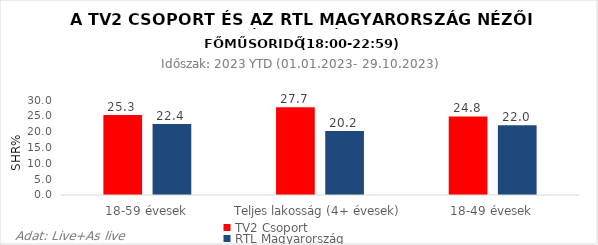
| Category | TV2 Csoport | RTL Magyarország |
|---|---|---|
| 18-59 évesek | 25.3 | 22.4 |
| Teljes lakosság (4+ évesek) | 27.7 | 20.2 |
| 18-49 évesek | 24.8 | 22 |